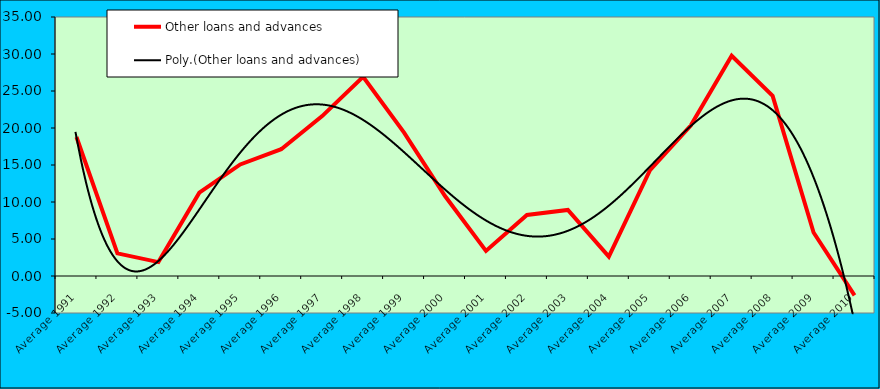
| Category | Other loans and advances |
|---|---|
| Average 1991 | 18.788 |
| Average 1992 | 3.059 |
| Average 1993 | 1.877 |
| Average 1994 | 11.257 |
| Average 1995 | 15.077 |
| Average 1996 | 17.13 |
| Average 1997 | 21.608 |
| Average 1998 | 26.929 |
| Average 1999 | 19.37 |
| Average 2000 | 10.808 |
| Average 2001 | 3.39 |
| Average 2002 | 8.252 |
| Average 2003 | 8.921 |
| Average 2004 | 2.621 |
| Average 2005 | 14.254 |
| Average 2006 | 20.338 |
| Average 2007 | 29.763 |
| Average 2008 | 24.333 |
| Average 2009 | 5.877 |
| Average 2010 | -2.614 |